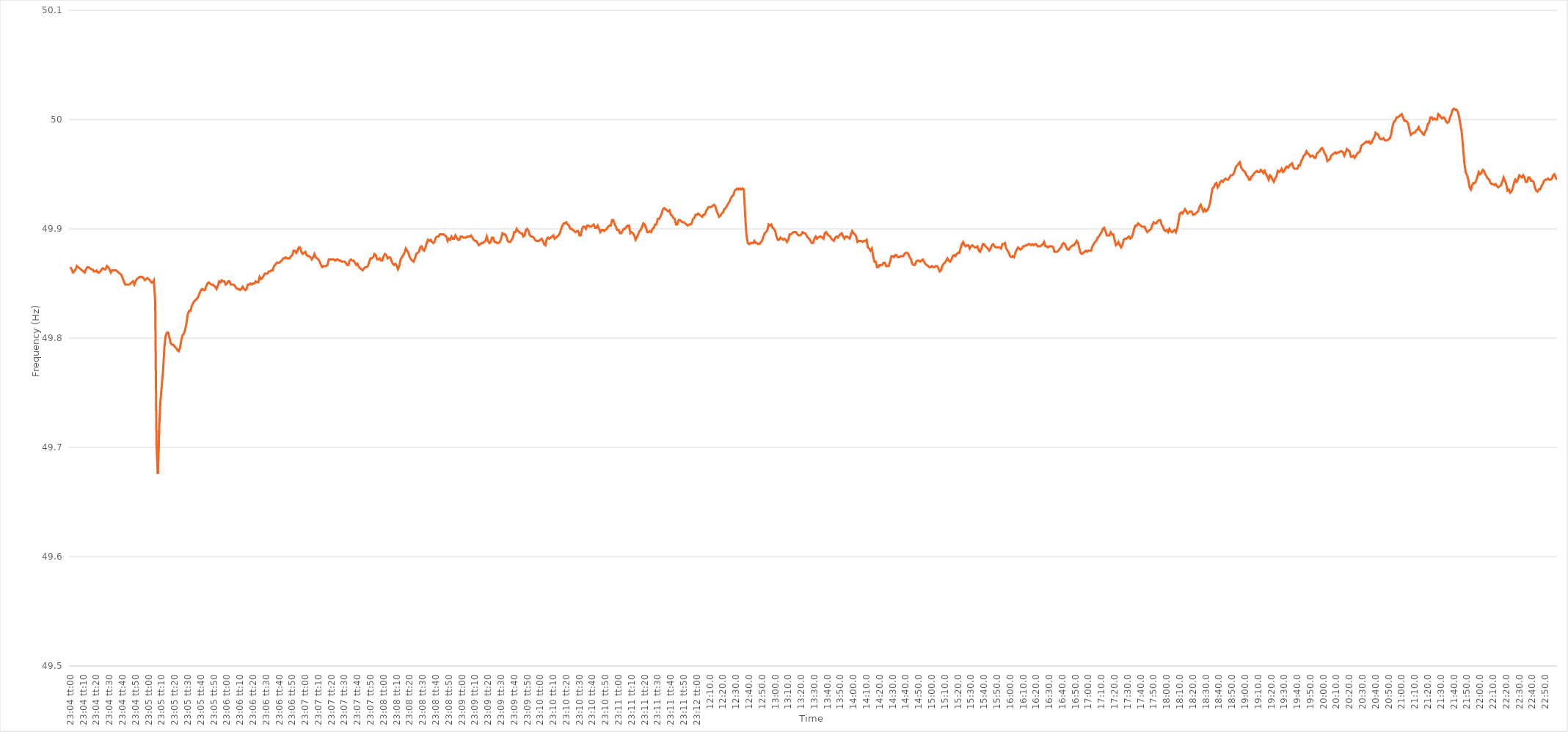
| Category | Series 0 |
|---|---|
| 0.9611111111111111 | 49.865 |
| 0.9611226851851852 | 49.863 |
| 0.9611342592592593 | 49.86 |
| 0.9611458333333333 | 49.861 |
| 0.9611574074074074 | 49.863 |
| 0.9611689814814816 | 49.866 |
| 0.9611805555555555 | 49.865 |
| 0.9611921296296296 | 49.864 |
| 0.9612037037037037 | 49.863 |
| 0.9612152777777778 | 49.862 |
| 0.9612268518518517 | 49.861 |
| 0.9612384259259259 | 49.86 |
| 0.96125 | 49.863 |
| 0.9612615740740741 | 49.865 |
| 0.9612731481481481 | 49.865 |
| 0.9612847222222222 | 49.864 |
| 0.9612962962962963 | 49.863 |
| 0.9613078703703705 | 49.863 |
| 0.9613194444444444 | 49.861 |
| 0.9613310185185185 | 49.861 |
| 0.9613425925925926 | 49.862 |
| 0.9613541666666667 | 49.86 |
| 0.9613657407407407 | 49.86 |
| 0.9613773148148148 | 49.861 |
| 0.961388888888889 | 49.863 |
| 0.961400462962963 | 49.864 |
| 0.961412037037037 | 49.863 |
| 0.9614236111111111 | 49.863 |
| 0.9614351851851852 | 49.866 |
| 0.9614467592592592 | 49.865 |
| 0.9614583333333333 | 49.863 |
| 0.9614699074074075 | 49.86 |
| 0.9614814814814815 | 49.862 |
| 0.9614930555555555 | 49.862 |
| 0.9615046296296296 | 49.862 |
| 0.9615162037037037 | 49.862 |
| 0.9615277777777779 | 49.861 |
| 0.9615393518518518 | 49.86 |
| 0.961550925925926 | 49.859 |
| 0.9615625 | 49.858 |
| 0.9615740740740741 | 49.855 |
| 0.9615856481481481 | 49.852 |
| 0.9615972222222222 | 49.849 |
| 0.9616087962962964 | 49.849 |
| 0.9616203703703704 | 49.849 |
| 0.9616319444444444 | 49.849 |
| 0.9616435185185185 | 49.85 |
| 0.9616550925925926 | 49.851 |
| 0.9616666666666666 | 49.852 |
| 0.9616782407407407 | 49.849 |
| 0.9616898148148149 | 49.852 |
| 0.9617013888888889 | 49.854 |
| 0.9617129629629629 | 49.855 |
| 0.961724537037037 | 49.856 |
| 0.9617361111111111 | 49.856 |
| 0.9617476851851853 | 49.856 |
| 0.9617592592592592 | 49.855 |
| 0.9617708333333334 | 49.853 |
| 0.9617824074074074 | 49.854 |
| 0.9617939814814815 | 49.855 |
| 0.9618055555555555 | 49.854 |
| 0.9618171296296296 | 49.853 |
| 0.9618287037037038 | 49.851 |
| 0.9618402777777778 | 49.851 |
| 0.9618518518518518 | 49.853 |
| 0.9618634259259259 | 49.833 |
| 0.961875 | 49.703 |
| 0.961886574074074 | 49.676 |
| 0.9618981481481481 | 49.716 |
| 0.9619097222222223 | 49.742 |
| 0.9619212962962963 | 49.756 |
| 0.9619328703703703 | 49.77 |
| 0.9619444444444444 | 49.791 |
| 0.9619560185185185 | 49.802 |
| 0.9619675925925927 | 49.805 |
| 0.9619791666666666 | 49.805 |
| 0.9619907407407408 | 49.8 |
| 0.9620023148148148 | 49.795 |
| 0.962013888888889 | 49.794 |
| 0.9620254629629629 | 49.794 |
| 0.962037037037037 | 49.792 |
| 0.9620486111111112 | 49.791 |
| 0.9620601851851852 | 49.789 |
| 0.9620717592592593 | 49.788 |
| 0.9620833333333333 | 49.791 |
| 0.9620949074074074 | 49.798 |
| 0.9621064814814816 | 49.803 |
| 0.9621180555555555 | 49.804 |
| 0.9621296296296297 | 49.808 |
| 0.9621412037037037 | 49.814 |
| 0.9621527777777777 | 49.822 |
| 0.9621643518518518 | 49.825 |
| 0.9621759259259259 | 49.825 |
| 0.9621875000000001 | 49.829 |
| 0.962199074074074 | 49.832 |
| 0.9622106481481482 | 49.834 |
| 0.9622222222222222 | 49.835 |
| 0.9622337962962964 | 49.836 |
| 0.9622453703703703 | 49.838 |
| 0.9622569444444444 | 49.841 |
| 0.9622685185185186 | 49.844 |
| 0.9622800925925926 | 49.845 |
| 0.9622916666666667 | 49.844 |
| 0.9623032407407407 | 49.844 |
| 0.9623148148148148 | 49.847 |
| 0.962326388888889 | 49.85 |
| 0.9623379629629629 | 49.851 |
| 0.9623495370370371 | 49.85 |
| 0.9623611111111111 | 49.849 |
| 0.9623726851851852 | 49.849 |
| 0.9623842592592592 | 49.848 |
| 0.9623958333333333 | 49.847 |
| 0.9624074074074075 | 49.845 |
| 0.9624189814814814 | 49.848 |
| 0.9624305555555556 | 49.852 |
| 0.9624421296296296 | 49.851 |
| 0.9624537037037038 | 49.853 |
| 0.9624652777777777 | 49.852 |
| 0.9624768518518518 | 49.852 |
| 0.962488425925926 | 49.849 |
| 0.9625 | 49.85 |
| 0.9625115740740741 | 49.852 |
| 0.9625231481481481 | 49.852 |
| 0.9625347222222222 | 49.849 |
| 0.9625462962962964 | 49.849 |
| 0.9625578703703703 | 49.849 |
| 0.9625694444444445 | 49.848 |
| 0.9625810185185185 | 49.846 |
| 0.9625925925925927 | 49.845 |
| 0.9626041666666666 | 49.845 |
| 0.9626157407407407 | 49.844 |
| 0.9626273148148149 | 49.845 |
| 0.9626388888888888 | 49.847 |
| 0.962650462962963 | 49.845 |
| 0.962662037037037 | 49.844 |
| 0.9626736111111112 | 49.845 |
| 0.9626851851851851 | 49.849 |
| 0.9626967592592592 | 49.849 |
| 0.9627083333333334 | 49.85 |
| 0.9627199074074074 | 49.849 |
| 0.9627314814814815 | 49.85 |
| 0.9627430555555555 | 49.85 |
| 0.9627546296296297 | 49.852 |
| 0.9627662037037038 | 49.851 |
| 0.9627777777777777 | 49.851 |
| 0.9627893518518519 | 49.856 |
| 0.9628009259259259 | 49.854 |
| 0.9628125000000001 | 49.855 |
| 0.962824074074074 | 49.857 |
| 0.9628356481481481 | 49.859 |
| 0.9628472222222223 | 49.859 |
| 0.9628587962962962 | 49.859 |
| 0.9628703703703704 | 49.861 |
| 0.9628819444444444 | 49.861 |
| 0.9628935185185186 | 49.862 |
| 0.9629050925925925 | 49.862 |
| 0.9629166666666666 | 49.866 |
| 0.9629282407407408 | 49.867 |
| 0.9629398148148148 | 49.869 |
| 0.9629513888888889 | 49.869 |
| 0.9629629629629629 | 49.869 |
| 0.9629745370370371 | 49.87 |
| 0.9629861111111112 | 49.871 |
| 0.9629976851851851 | 49.873 |
| 0.9630092592592593 | 49.873 |
| 0.9630208333333333 | 49.874 |
| 0.9630324074074075 | 49.873 |
| 0.9630439814814814 | 49.873 |
| 0.9630555555555556 | 49.873 |
| 0.9630671296296297 | 49.875 |
| 0.9630787037037036 | 49.876 |
| 0.9630902777777778 | 49.88 |
| 0.9631018518518518 | 49.88 |
| 0.963113425925926 | 49.878 |
| 0.9631249999999999 | 49.88 |
| 0.963136574074074 | 49.883 |
| 0.9631481481481482 | 49.883 |
| 0.9631597222222222 | 49.879 |
| 0.9631712962962963 | 49.877 |
| 0.9631828703703703 | 49.878 |
| 0.9631944444444445 | 49.879 |
| 0.9632060185185186 | 49.876 |
| 0.9632175925925925 | 49.875 |
| 0.9632291666666667 | 49.875 |
| 0.9632407407407407 | 49.874 |
| 0.9632523148148149 | 49.872 |
| 0.9632638888888888 | 49.874 |
| 0.963275462962963 | 49.877 |
| 0.9632870370370371 | 49.874 |
| 0.9632986111111111 | 49.873 |
| 0.9633101851851852 | 49.872 |
| 0.9633217592592592 | 49.87 |
| 0.9633333333333334 | 49.867 |
| 0.9633449074074073 | 49.865 |
| 0.9633564814814815 | 49.866 |
| 0.9633680555555556 | 49.866 |
| 0.9633796296296296 | 49.866 |
| 0.9633912037037037 | 49.867 |
| 0.9634027777777777 | 49.872 |
| 0.9634143518518519 | 49.872 |
| 0.963425925925926 | 49.872 |
| 0.9634375 | 49.872 |
| 0.9634490740740741 | 49.872 |
| 0.9634606481481481 | 49.871 |
| 0.9634722222222223 | 49.872 |
| 0.9634837962962962 | 49.872 |
| 0.9634953703703704 | 49.871 |
| 0.9635069444444445 | 49.871 |
| 0.9635185185185186 | 49.87 |
| 0.9635300925925926 | 49.87 |
| 0.9635416666666666 | 49.87 |
| 0.9635532407407408 | 49.869 |
| 0.9635648148148147 | 49.867 |
| 0.9635763888888889 | 49.867 |
| 0.963587962962963 | 49.871 |
| 0.963599537037037 | 49.872 |
| 0.9636111111111111 | 49.871 |
| 0.9636226851851851 | 49.871 |
| 0.9636342592592593 | 49.869 |
| 0.9636458333333334 | 49.867 |
| 0.9636574074074074 | 49.868 |
| 0.9636689814814815 | 49.865 |
| 0.9636805555555555 | 49.864 |
| 0.9636921296296297 | 49.863 |
| 0.9637037037037036 | 49.862 |
| 0.9637152777777778 | 49.864 |
| 0.9637268518518519 | 49.865 |
| 0.963738425925926 | 49.865 |
| 0.96375 | 49.866 |
| 0.963761574074074 | 49.87 |
| 0.9637731481481482 | 49.873 |
| 0.9637847222222221 | 49.873 |
| 0.9637962962962963 | 49.874 |
| 0.9638078703703704 | 49.877 |
| 0.9638194444444445 | 49.876 |
| 0.9638310185185185 | 49.872 |
| 0.9638425925925925 | 49.872 |
| 0.9638541666666667 | 49.873 |
| 0.9638657407407408 | 49.871 |
| 0.9638773148148148 | 49.871 |
| 0.9638888888888889 | 49.875 |
| 0.963900462962963 | 49.877 |
| 0.9639120370370371 | 49.876 |
| 0.963923611111111 | 49.873 |
| 0.9639351851851852 | 49.874 |
| 0.9639467592592593 | 49.874 |
| 0.9639583333333334 | 49.871 |
| 0.9639699074074074 | 49.868 |
| 0.9639814814814814 | 49.867 |
| 0.9639930555555556 | 49.868 |
| 0.9640046296296297 | 49.866 |
| 0.9640162037037037 | 49.863 |
| 0.9640277777777778 | 49.866 |
| 0.9640393518518519 | 49.872 |
| 0.9640509259259259 | 49.874 |
| 0.9640624999999999 | 49.876 |
| 0.9640740740740741 | 49.878 |
| 0.9640856481481482 | 49.882 |
| 0.9640972222222222 | 49.88 |
| 0.9641087962962963 | 49.878 |
| 0.9641203703703703 | 49.874 |
| 0.9641319444444445 | 49.872 |
| 0.9641435185185184 | 49.871 |
| 0.9641550925925926 | 49.87 |
| 0.9641666666666667 | 49.873 |
| 0.9641782407407408 | 49.877 |
| 0.9641898148148148 | 49.878 |
| 0.9642013888888888 | 49.879 |
| 0.964212962962963 | 49.883 |
| 0.9642245370370371 | 49.884 |
| 0.9642361111111111 | 49.881 |
| 0.9642476851851852 | 49.88 |
| 0.9642592592592593 | 49.883 |
| 0.9642708333333333 | 49.887 |
| 0.9642824074074073 | 49.89 |
| 0.9642939814814815 | 49.889 |
| 0.9643055555555556 | 49.89 |
| 0.9643171296296296 | 49.888 |
| 0.9643287037037037 | 49.887 |
| 0.9643402777777778 | 49.888 |
| 0.9643518518518519 | 49.892 |
| 0.9643634259259258 | 49.893 |
| 0.964375 | 49.893 |
| 0.9643865740740741 | 49.895 |
| 0.9643981481481482 | 49.895 |
| 0.9644097222222222 | 49.895 |
| 0.9644212962962962 | 49.895 |
| 0.9644328703703704 | 49.894 |
| 0.9644444444444445 | 49.893 |
| 0.9644560185185185 | 49.889 |
| 0.9644675925925926 | 49.891 |
| 0.9644791666666667 | 49.89 |
| 0.9644907407407407 | 49.893 |
| 0.9645023148148147 | 49.891 |
| 0.9645138888888889 | 49.891 |
| 0.964525462962963 | 49.894 |
| 0.964537037037037 | 49.892 |
| 0.9645486111111111 | 49.89 |
| 0.9645601851851852 | 49.89 |
| 0.9645717592592593 | 49.893 |
| 0.9645833333333332 | 49.893 |
| 0.9645949074074074 | 49.892 |
| 0.9646064814814815 | 49.892 |
| 0.9646180555555556 | 49.892 |
| 0.9646296296296296 | 49.893 |
| 0.9646412037037037 | 49.893 |
| 0.9646527777777778 | 49.893 |
| 0.964664351851852 | 49.894 |
| 0.9646759259259259 | 49.892 |
| 0.9646875 | 49.89 |
| 0.9646990740740741 | 49.889 |
| 0.9647106481481482 | 49.889 |
| 0.9647222222222221 | 49.887 |
| 0.9647337962962963 | 49.885 |
| 0.9647453703703704 | 49.886 |
| 0.9647569444444444 | 49.887 |
| 0.9647685185185185 | 49.887 |
| 0.9647800925925926 | 49.888 |
| 0.9647916666666667 | 49.889 |
| 0.9648032407407406 | 49.893 |
| 0.9648148148148148 | 49.889 |
| 0.9648263888888889 | 49.887 |
| 0.964837962962963 | 49.888 |
| 0.964849537037037 | 49.892 |
| 0.9648611111111111 | 49.892 |
| 0.9648726851851852 | 49.888 |
| 0.9648842592592594 | 49.888 |
| 0.9648958333333333 | 49.887 |
| 0.9649074074074074 | 49.887 |
| 0.9649189814814815 | 49.888 |
| 0.9649305555555556 | 49.891 |
| 0.9649421296296296 | 49.896 |
| 0.9649537037037037 | 49.895 |
| 0.9649652777777779 | 49.895 |
| 0.9649768518518518 | 49.893 |
| 0.9649884259259259 | 49.889 |
| 0.965 | 49.888 |
| 0.9650115740740741 | 49.888 |
| 0.965023148148148 | 49.89 |
| 0.9650347222222222 | 49.892 |
| 0.9650462962962963 | 49.897 |
| 0.9650578703703704 | 49.897 |
| 0.9650694444444444 | 49.9 |
| 0.9650810185185185 | 49.898 |
| 0.9650925925925926 | 49.897 |
| 0.9651041666666668 | 49.896 |
| 0.9651157407407407 | 49.896 |
| 0.9651273148148148 | 49.893 |
| 0.9651388888888889 | 49.894 |
| 0.965150462962963 | 49.899 |
| 0.965162037037037 | 49.9 |
| 0.9651736111111111 | 49.898 |
| 0.9651851851851853 | 49.894 |
| 0.9651967592592593 | 49.893 |
| 0.9652083333333333 | 49.893 |
| 0.9652199074074074 | 49.892 |
| 0.9652314814814815 | 49.89 |
| 0.9652430555555555 | 49.889 |
| 0.9652546296296296 | 49.889 |
| 0.9652662037037038 | 49.889 |
| 0.9652777777777778 | 49.89 |
| 0.9652893518518518 | 49.891 |
| 0.9653009259259259 | 49.889 |
| 0.9653125 | 49.886 |
| 0.9653240740740742 | 49.885 |
| 0.9653356481481481 | 49.891 |
| 0.9653472222222222 | 49.892 |
| 0.9653587962962963 | 49.891 |
| 0.9653703703703704 | 49.892 |
| 0.9653819444444444 | 49.893 |
| 0.9653935185185185 | 49.894 |
| 0.9654050925925927 | 49.891 |
| 0.9654166666666667 | 49.892 |
| 0.9654282407407407 | 49.893 |
| 0.9654398148148148 | 49.894 |
| 0.9654513888888889 | 49.896 |
| 0.9654629629629629 | 49.9 |
| 0.965474537037037 | 49.903 |
| 0.9654861111111112 | 49.905 |
| 0.9654976851851852 | 49.905 |
| 0.9655092592592592 | 49.906 |
| 0.9655208333333333 | 49.904 |
| 0.9655324074074074 | 49.903 |
| 0.9655439814814816 | 49.9 |
| 0.9655555555555555 | 49.9 |
| 0.9655671296296297 | 49.899 |
| 0.9655787037037037 | 49.898 |
| 0.9655902777777778 | 49.897 |
| 0.9656018518518518 | 49.898 |
| 0.9656134259259259 | 49.898 |
| 0.9656250000000001 | 49.894 |
| 0.9656365740740741 | 49.894 |
| 0.9656481481481481 | 49.9 |
| 0.9656597222222222 | 49.902 |
| 0.9656712962962963 | 49.902 |
| 0.9656828703703703 | 49.9 |
| 0.9656944444444444 | 49.903 |
| 0.9657060185185186 | 49.903 |
| 0.9657175925925926 | 49.902 |
| 0.9657291666666666 | 49.902 |
| 0.9657407407407407 | 49.903 |
| 0.9657523148148148 | 49.904 |
| 0.965763888888889 | 49.901 |
| 0.9657754629629629 | 49.901 |
| 0.965787037037037 | 49.903 |
| 0.9657986111111111 | 49.9 |
| 0.9658101851851852 | 49.897 |
| 0.9658217592592592 | 49.899 |
| 0.9658333333333333 | 49.899 |
| 0.9658449074074075 | 49.898 |
| 0.9658564814814815 | 49.899 |
| 0.9658680555555555 | 49.9 |
| 0.9658796296296296 | 49.902 |
| 0.9658912037037037 | 49.903 |
| 0.9659027777777779 | 49.903 |
| 0.9659143518518518 | 49.908 |
| 0.965925925925926 | 49.908 |
| 0.9659375 | 49.904 |
| 0.965949074074074 | 49.902 |
| 0.9659606481481481 | 49.899 |
| 0.9659722222222222 | 49.899 |
| 0.9659837962962964 | 49.896 |
| 0.9659953703703703 | 49.896 |
| 0.9660069444444445 | 49.898 |
| 0.9660185185185185 | 49.9 |
| 0.9660300925925926 | 49.9 |
| 0.9660416666666666 | 49.902 |
| 0.9660532407407407 | 49.903 |
| 0.9660648148148149 | 49.903 |
| 0.9660763888888889 | 49.896 |
| 0.966087962962963 | 49.897 |
| 0.966099537037037 | 49.896 |
| 0.9661111111111111 | 49.894 |
| 0.9661226851851853 | 49.89 |
| 0.9661342592592592 | 49.892 |
| 0.9661458333333334 | 49.895 |
| 0.9661574074074074 | 49.898 |
| 0.9661689814814814 | 49.899 |
| 0.9661805555555555 | 49.902 |
| 0.9661921296296296 | 49.905 |
| 0.9662037037037038 | 49.904 |
| 0.9662152777777777 | 49.901 |
| 0.9662268518518519 | 49.897 |
| 0.9662384259259259 | 49.897 |
| 0.96625 | 49.898 |
| 0.966261574074074 | 49.897 |
| 0.9662731481481481 | 49.9 |
| 0.9662847222222223 | 49.901 |
| 0.9662962962962963 | 49.904 |
| 0.9663078703703704 | 49.904 |
| 0.9663194444444444 | 49.909 |
| 0.9663310185185185 | 49.909 |
| 0.9663425925925927 | 49.911 |
| 0.9663541666666666 | 49.914 |
| 0.9663657407407408 | 49.918 |
| 0.9663773148148148 | 49.919 |
| 0.9663888888888889 | 49.918 |
| 0.9664004629629629 | 49.917 |
| 0.966412037037037 | 49.916 |
| 0.9664236111111112 | 49.917 |
| 0.9664351851851851 | 49.913 |
| 0.9664467592592593 | 49.912 |
| 0.9664583333333333 | 49.91 |
| 0.9664699074074075 | 49.909 |
| 0.9664814814814814 | 49.904 |
| 0.9664930555555555 | 49.904 |
| 0.9665046296296297 | 49.908 |
| 0.9665162037037037 | 49.908 |
| 0.9665277777777778 | 49.907 |
| 0.9665393518518518 | 49.906 |
| 0.966550925925926 | 49.906 |
| 0.9665625000000001 | 49.905 |
| 0.966574074074074 | 49.904 |
| 0.9665856481481482 | 49.903 |
| 0.9665972222222222 | 49.904 |
| 0.9666087962962964 | 49.904 |
| 0.9666203703703703 | 49.905 |
| 0.9666319444444444 | 49.909 |
| 0.9666435185185186 | 49.91 |
| 0.9666550925925925 | 49.913 |
| 0.9666666666666667 | 49.913 |
| 0.9666782407407407 | 49.914 |
| 0.9666898148148149 | 49.913 |
| 0.9667013888888888 | 49.912 |
| 0.9667129629629629 | 49.911 |
| 0.9667245370370371 | 49.913 |
| 0.9667361111111111 | 49.913 |
| 0.9667476851851852 | 49.916 |
| 0.9667592592592592 | 49.918 |
| 0.9667708333333334 | 49.92 |
| 0.9667824074074075 | 49.92 |
| 0.9667939814814814 | 49.92 |
| 0.9668055555555556 | 49.921 |
| 0.9668171296296296 | 49.922 |
| 0.9668287037037038 | 49.921 |
| 0.9668402777777777 | 49.917 |
| 0.9668518518518519 | 49.914 |
| 0.966863425925926 | 49.911 |
| 0.9668749999999999 | 49.912 |
| 0.9668865740740741 | 49.914 |
| 0.9668981481481481 | 49.915 |
| 0.9669097222222223 | 49.918 |
| 0.9669212962962962 | 49.919 |
| 0.9669328703703703 | 49.921 |
| 0.9669444444444445 | 49.923 |
| 0.9669560185185185 | 49.925 |
| 0.9669675925925926 | 49.928 |
| 0.9669791666666666 | 49.93 |
| 0.9669907407407408 | 49.931 |
| 0.9670023148148149 | 49.935 |
| 0.9670138888888888 | 49.936 |
| 0.967025462962963 | 49.937 |
| 0.967037037037037 | 49.936 |
| 0.9670486111111112 | 49.937 |
| 0.9670601851851851 | 49.936 |
| 0.9670717592592593 | 49.937 |
| 0.9670833333333334 | 49.936 |
| 0.9670949074074073 | 49.912 |
| 0.9671064814814815 | 49.894 |
| 0.9671180555555555 | 49.887 |
| 0.9671296296296297 | 49.886 |
| 0.9671412037037036 | 49.887 |
| 0.9671527777777778 | 49.887 |
| 0.9671643518518519 | 49.887 |
| 0.9671759259259259 | 49.889 |
| 0.9671875 | 49.887 |
| 0.967199074074074 | 49.887 |
| 0.9672106481481482 | 49.886 |
| 0.9672222222222223 | 49.886 |
| 0.9672337962962962 | 49.888 |
| 0.9672453703703704 | 49.889 |
| 0.9672569444444444 | 49.893 |
| 0.9672685185185186 | 49.896 |
| 0.9672800925925925 | 49.897 |
| 0.9672916666666667 | 49.899 |
| 0.9673032407407408 | 49.904 |
| 0.9673148148148148 | 49.903 |
| 0.9673263888888889 | 49.904 |
| 0.9673379629629629 | 49.901 |
| 0.9673495370370371 | 49.9 |
| 0.967361111111111 | 49.898 |
| 0.9673726851851852 | 49.893 |
| 0.9673842592592593 | 49.89 |
| 0.9673958333333333 | 49.89 |
| 0.9674074074074074 | 49.892 |
| 0.9674189814814814 | 49.891 |
| 0.9674305555555556 | 49.89 |
| 0.9674421296296297 | 49.891 |
| 0.9674537037037036 | 49.89 |
| 0.9674652777777778 | 49.888 |
| 0.9674768518518518 | 49.89 |
| 0.967488425925926 | 49.895 |
| 0.9674999999999999 | 49.895 |
| 0.9675115740740741 | 49.896 |
| 0.9675231481481482 | 49.897 |
| 0.9675347222222223 | 49.897 |
| 0.9675462962962963 | 49.897 |
| 0.9675578703703703 | 49.895 |
| 0.9675694444444445 | 49.894 |
| 0.9675810185185184 | 49.894 |
| 0.9675925925925926 | 49.895 |
| 0.9676041666666667 | 49.897 |
| 0.9676157407407407 | 49.896 |
| 0.9676273148148148 | 49.896 |
| 0.9676388888888888 | 49.894 |
| 0.967650462962963 | 49.892 |
| 0.9676620370370371 | 49.891 |
| 0.967673611111111 | 49.889 |
| 0.9676851851851852 | 49.887 |
| 0.9676967592592592 | 49.887 |
| 0.9677083333333334 | 49.891 |
| 0.9677199074074073 | 49.893 |
| 0.9677314814814815 | 49.891 |
| 0.9677430555555556 | 49.892 |
| 0.9677546296296297 | 49.893 |
| 0.9677662037037037 | 49.893 |
| 0.9677777777777777 | 49.892 |
| 0.9677893518518519 | 49.891 |
| 0.967800925925926 | 49.896 |
| 0.9678125 | 49.897 |
| 0.9678240740740741 | 49.895 |
| 0.9678356481481482 | 49.894 |
| 0.9678472222222222 | 49.893 |
| 0.9678587962962962 | 49.891 |
| 0.9678703703703704 | 49.89 |
| 0.9678819444444445 | 49.889 |
| 0.9678935185185185 | 49.892 |
| 0.9679050925925926 | 49.893 |
| 0.9679166666666666 | 49.892 |
| 0.9679282407407408 | 49.894 |
| 0.9679398148148147 | 49.895 |
| 0.9679513888888889 | 49.896 |
| 0.967962962962963 | 49.893 |
| 0.9679745370370371 | 49.891 |
| 0.9679861111111111 | 49.893 |
| 0.9679976851851851 | 49.893 |
| 0.9680092592592593 | 49.892 |
| 0.9680208333333334 | 49.891 |
| 0.9680324074074074 | 49.895 |
| 0.9680439814814815 | 49.898 |
| 0.9680555555555556 | 49.896 |
| 0.9680671296296296 | 49.895 |
| 0.9680787037037036 | 49.893 |
| 0.9680902777777778 | 49.888 |
| 0.9681018518518519 | 49.889 |
| 0.9681134259259259 | 49.889 |
| 0.968125 | 49.889 |
| 0.968136574074074 | 49.888 |
| 0.9681481481481482 | 49.889 |
| 0.9681597222222221 | 49.889 |
| 0.9681712962962963 | 49.89 |
| 0.9681828703703704 | 49.883 |
| 0.9681944444444445 | 49.882 |
| 0.9682060185185185 | 49.88 |
| 0.9682175925925925 | 49.882 |
| 0.9682291666666667 | 49.875 |
| 0.9682407407407408 | 49.87 |
| 0.9682523148148148 | 49.87 |
| 0.9682638888888889 | 49.865 |
| 0.968275462962963 | 49.865 |
| 0.968287037037037 | 49.867 |
| 0.968298611111111 | 49.867 |
| 0.9683101851851852 | 49.867 |
| 0.9683217592592593 | 49.869 |
| 0.9683333333333333 | 49.869 |
| 0.9683449074074074 | 49.866 |
| 0.9683564814814815 | 49.866 |
| 0.9683680555555556 | 49.866 |
| 0.9683796296296295 | 49.87 |
| 0.9683912037037037 | 49.875 |
| 0.9684027777777778 | 49.875 |
| 0.9684143518518519 | 49.874 |
| 0.9684259259259259 | 49.876 |
| 0.9684375 | 49.876 |
| 0.9684490740740741 | 49.874 |
| 0.9684606481481483 | 49.874 |
| 0.9684722222222222 | 49.875 |
| 0.9684837962962963 | 49.875 |
| 0.9684953703703704 | 49.875 |
| 0.9685069444444445 | 49.877 |
| 0.9685185185185184 | 49.878 |
| 0.9685300925925926 | 49.878 |
| 0.9685416666666667 | 49.877 |
| 0.9685532407407407 | 49.874 |
| 0.9685648148148148 | 49.872 |
| 0.9685763888888889 | 49.868 |
| 0.968587962962963 | 49.867 |
| 0.9685995370370369 | 49.867 |
| 0.9686111111111111 | 49.87 |
| 0.9686226851851852 | 49.871 |
| 0.9686342592592593 | 49.871 |
| 0.9686458333333333 | 49.87 |
| 0.9686574074074074 | 49.871 |
| 0.9686689814814815 | 49.872 |
| 0.9686805555555557 | 49.87 |
| 0.9686921296296296 | 49.868 |
| 0.9687037037037037 | 49.867 |
| 0.9687152777777778 | 49.866 |
| 0.9687268518518519 | 49.865 |
| 0.9687384259259259 | 49.865 |
| 0.96875 | 49.866 |
| 0.9687615740740741 | 49.865 |
| 0.9687731481481481 | 49.865 |
| 0.9687847222222222 | 49.866 |
| 0.9687962962962963 | 49.866 |
| 0.9688078703703704 | 49.864 |
| 0.9688194444444443 | 49.861 |
| 0.9688310185185185 | 49.862 |
| 0.9688425925925926 | 49.866 |
| 0.9688541666666667 | 49.868 |
| 0.9688657407407407 | 49.869 |
| 0.9688773148148148 | 49.871 |
| 0.9688888888888889 | 49.873 |
| 0.9689004629629631 | 49.871 |
| 0.968912037037037 | 49.87 |
| 0.9689236111111111 | 49.872 |
| 0.9689351851851852 | 49.875 |
| 0.9689467592592593 | 49.876 |
| 0.9689583333333333 | 49.875 |
| 0.9689699074074074 | 49.877 |
| 0.9689814814814816 | 49.878 |
| 0.9689930555555555 | 49.878 |
| 0.9690046296296296 | 49.882 |
| 0.9690162037037037 | 49.886 |
| 0.9690277777777778 | 49.888 |
| 0.9690393518518517 | 49.885 |
| 0.9690509259259259 | 49.884 |
| 0.9690625 | 49.885 |
| 0.9690740740740741 | 49.885 |
| 0.9690856481481481 | 49.882 |
| 0.9690972222222222 | 49.884 |
| 0.9691087962962963 | 49.885 |
| 0.9691203703703705 | 49.884 |
| 0.9691319444444444 | 49.883 |
| 0.9691435185185185 | 49.883 |
| 0.9691550925925926 | 49.884 |
| 0.9691666666666667 | 49.88 |
| 0.9691782407407407 | 49.879 |
| 0.9691898148148148 | 49.882 |
| 0.969201388888889 | 49.886 |
| 0.969212962962963 | 49.886 |
| 0.969224537037037 | 49.884 |
| 0.9692361111111111 | 49.883 |
| 0.9692476851851852 | 49.882 |
| 0.9692592592592592 | 49.88 |
| 0.9692708333333333 | 49.882 |
| 0.9692824074074075 | 49.885 |
| 0.9692939814814815 | 49.886 |
| 0.9693055555555555 | 49.884 |
| 0.9693171296296296 | 49.883 |
| 0.9693287037037037 | 49.883 |
| 0.9693402777777779 | 49.883 |
| 0.9693518518518518 | 49.883 |
| 0.969363425925926 | 49.882 |
| 0.969375 | 49.886 |
| 0.9693865740740741 | 49.886 |
| 0.9693981481481481 | 49.887 |
| 0.9694097222222222 | 49.882 |
| 0.9694212962962964 | 49.88 |
| 0.9694328703703704 | 49.878 |
| 0.9694444444444444 | 49.875 |
| 0.9694560185185185 | 49.874 |
| 0.9694675925925926 | 49.875 |
| 0.9694791666666666 | 49.874 |
| 0.9694907407407407 | 49.878 |
| 0.9695023148148149 | 49.881 |
| 0.9695138888888889 | 49.883 |
| 0.9695254629629629 | 49.882 |
| 0.969537037037037 | 49.881 |
| 0.9695486111111111 | 49.882 |
| 0.9695601851851853 | 49.884 |
| 0.9695717592592592 | 49.884 |
| 0.9695833333333334 | 49.885 |
| 0.9695949074074074 | 49.885 |
| 0.9696064814814815 | 49.886 |
| 0.9696180555555555 | 49.886 |
| 0.9696296296296296 | 49.885 |
| 0.9696412037037038 | 49.886 |
| 0.9696527777777778 | 49.885 |
| 0.9696643518518518 | 49.886 |
| 0.9696759259259259 | 49.886 |
| 0.9696875 | 49.884 |
| 0.969699074074074 | 49.884 |
| 0.9697106481481481 | 49.884 |
| 0.9697222222222223 | 49.885 |
| 0.9697337962962963 | 49.886 |
| 0.9697453703703703 | 49.888 |
| 0.9697569444444444 | 49.884 |
| 0.9697685185185185 | 49.884 |
| 0.9697800925925927 | 49.883 |
| 0.9697916666666666 | 49.884 |
| 0.9698032407407408 | 49.884 |
| 0.9698148148148148 | 49.884 |
| 0.969826388888889 | 49.883 |
| 0.9698379629629629 | 49.879 |
| 0.969849537037037 | 49.879 |
| 0.9698611111111112 | 49.879 |
| 0.9698726851851852 | 49.88 |
| 0.9698842592592593 | 49.882 |
| 0.9698958333333333 | 49.883 |
| 0.9699074074074074 | 49.886 |
| 0.9699189814814816 | 49.887 |
| 0.9699305555555555 | 49.886 |
| 0.9699421296296297 | 49.883 |
| 0.9699537037037037 | 49.881 |
| 0.9699652777777777 | 49.881 |
| 0.9699768518518518 | 49.883 |
| 0.9699884259259259 | 49.884 |
| 0.9700000000000001 | 49.885 |
| 0.970011574074074 | 49.885 |
| 0.9700231481481482 | 49.887 |
| 0.9700347222222222 | 49.889 |
| 0.9700462962962964 | 49.887 |
| 0.9700578703703703 | 49.882 |
| 0.9700694444444444 | 49.878 |
| 0.9700810185185186 | 49.877 |
| 0.9700925925925926 | 49.878 |
| 0.9701041666666667 | 49.879 |
| 0.9701157407407407 | 49.88 |
| 0.9701273148148148 | 49.879 |
| 0.970138888888889 | 49.88 |
| 0.9701504629629629 | 49.88 |
| 0.9701620370370371 | 49.88 |
| 0.9701736111111111 | 49.884 |
| 0.9701851851851852 | 49.886 |
| 0.9701967592592592 | 49.888 |
| 0.9702083333333333 | 49.889 |
| 0.9702199074074075 | 49.892 |
| 0.9702314814814814 | 49.893 |
| 0.9702430555555556 | 49.895 |
| 0.9702546296296296 | 49.897 |
| 0.9702662037037038 | 49.9 |
| 0.9702777777777777 | 49.901 |
| 0.9702893518518518 | 49.898 |
| 0.970300925925926 | 49.894 |
| 0.9703125 | 49.894 |
| 0.9703240740740741 | 49.894 |
| 0.9703356481481481 | 49.897 |
| 0.9703472222222222 | 49.895 |
| 0.9703587962962964 | 49.895 |
| 0.9703703703703703 | 49.89 |
| 0.9703819444444445 | 49.885 |
| 0.9703935185185185 | 49.886 |
| 0.9704050925925927 | 49.888 |
| 0.9704166666666666 | 49.885 |
| 0.9704282407407407 | 49.883 |
| 0.9704398148148149 | 49.885 |
| 0.9704513888888888 | 49.89 |
| 0.970462962962963 | 49.891 |
| 0.970474537037037 | 49.891 |
| 0.9704861111111112 | 49.892 |
| 0.9704976851851851 | 49.893 |
| 0.9705092592592592 | 49.891 |
| 0.9705208333333334 | 49.892 |
| 0.9705324074074074 | 49.895 |
| 0.9705439814814815 | 49.9 |
| 0.9705555555555555 | 49.903 |
| 0.9705671296296297 | 49.903 |
| 0.9705787037037038 | 49.905 |
| 0.9705902777777777 | 49.904 |
| 0.9706018518518519 | 49.903 |
| 0.9706134259259259 | 49.902 |
| 0.9706250000000001 | 49.902 |
| 0.970636574074074 | 49.902 |
| 0.9706481481481481 | 49.899 |
| 0.9706597222222223 | 49.897 |
| 0.9706712962962962 | 49.898 |
| 0.9706828703703704 | 49.899 |
| 0.9706944444444444 | 49.9 |
| 0.9707060185185186 | 49.904 |
| 0.9707175925925925 | 49.906 |
| 0.9707291666666666 | 49.905 |
| 0.9707407407407408 | 49.905 |
| 0.9707523148148148 | 49.907 |
| 0.9707638888888889 | 49.908 |
| 0.9707754629629629 | 49.908 |
| 0.9707870370370371 | 49.904 |
| 0.9707986111111112 | 49.902 |
| 0.9708101851851851 | 49.899 |
| 0.9708217592592593 | 49.898 |
| 0.9708333333333333 | 49.899 |
| 0.9708449074074075 | 49.897 |
| 0.9708564814814814 | 49.9 |
| 0.9708680555555556 | 49.898 |
| 0.9708796296296297 | 49.897 |
| 0.9708912037037036 | 49.898 |
| 0.9709027777777778 | 49.899 |
| 0.9709143518518518 | 49.897 |
| 0.970925925925926 | 49.901 |
| 0.9709374999999999 | 49.907 |
| 0.970949074074074 | 49.914 |
| 0.9709606481481482 | 49.915 |
| 0.9709722222222222 | 49.914 |
| 0.9709837962962963 | 49.916 |
| 0.9709953703703703 | 49.918 |
| 0.9710069444444445 | 49.916 |
| 0.9710185185185186 | 49.914 |
| 0.9710300925925925 | 49.915 |
| 0.9710416666666667 | 49.916 |
| 0.9710532407407407 | 49.916 |
| 0.9710648148148149 | 49.913 |
| 0.9710763888888888 | 49.913 |
| 0.971087962962963 | 49.914 |
| 0.9710995370370371 | 49.915 |
| 0.971111111111111 | 49.916 |
| 0.9711226851851852 | 49.92 |
| 0.9711342592592592 | 49.922 |
| 0.9711458333333334 | 49.919 |
| 0.9711574074074073 | 49.916 |
| 0.9711689814814815 | 49.918 |
| 0.9711805555555556 | 49.916 |
| 0.9711921296296296 | 49.917 |
| 0.9712037037037037 | 49.919 |
| 0.9712152777777777 | 49.923 |
| 0.9712268518518519 | 49.93 |
| 0.971238425925926 | 49.937 |
| 0.97125 | 49.938 |
| 0.9712615740740741 | 49.941 |
| 0.9712731481481481 | 49.942 |
| 0.9712847222222223 | 49.938 |
| 0.9712962962962962 | 49.94 |
| 0.9713078703703704 | 49.943 |
| 0.9713194444444445 | 49.944 |
| 0.9713310185185186 | 49.943 |
| 0.9713425925925926 | 49.945 |
| 0.9713541666666666 | 49.946 |
| 0.9713657407407408 | 49.945 |
| 0.9713773148148147 | 49.945 |
| 0.9713888888888889 | 49.947 |
| 0.971400462962963 | 49.949 |
| 0.971412037037037 | 49.949 |
| 0.9714236111111111 | 49.95 |
| 0.9714351851851851 | 49.953 |
| 0.9714467592592593 | 49.957 |
| 0.9714583333333334 | 49.958 |
| 0.9714699074074074 | 49.96 |
| 0.9714814814814815 | 49.961 |
| 0.9714930555555555 | 49.956 |
| 0.9715046296296297 | 49.954 |
| 0.9715162037037036 | 49.953 |
| 0.9715277777777778 | 49.952 |
| 0.9715393518518519 | 49.949 |
| 0.971550925925926 | 49.948 |
| 0.9715625 | 49.945 |
| 0.971574074074074 | 49.945 |
| 0.9715856481481482 | 49.948 |
| 0.9715972222222223 | 49.949 |
| 0.9716087962962963 | 49.951 |
| 0.9716203703703704 | 49.952 |
| 0.9716319444444445 | 49.953 |
| 0.9716435185185185 | 49.952 |
| 0.9716550925925925 | 49.952 |
| 0.9716666666666667 | 49.954 |
| 0.9716782407407408 | 49.953 |
| 0.9716898148148148 | 49.951 |
| 0.9717013888888889 | 49.953 |
| 0.971712962962963 | 49.95 |
| 0.9717245370370371 | 49.948 |
| 0.971736111111111 | 49.945 |
| 0.9717476851851852 | 49.949 |
| 0.9717592592592593 | 49.948 |
| 0.9717708333333334 | 49.945 |
| 0.9717824074074074 | 49.943 |
| 0.9717939814814814 | 49.946 |
| 0.9718055555555556 | 49.948 |
| 0.9718171296296297 | 49.953 |
| 0.9718287037037037 | 49.952 |
| 0.9718402777777778 | 49.953 |
| 0.9718518518518519 | 49.955 |
| 0.9718634259259259 | 49.952 |
| 0.9718749999999999 | 49.953 |
| 0.9718865740740741 | 49.956 |
| 0.9718981481481482 | 49.957 |
| 0.9719097222222222 | 49.956 |
| 0.9719212962962963 | 49.958 |
| 0.9719328703703703 | 49.959 |
| 0.9719444444444445 | 49.96 |
| 0.9719560185185184 | 49.956 |
| 0.9719675925925926 | 49.955 |
| 0.9719791666666667 | 49.955 |
| 0.9719907407407408 | 49.955 |
| 0.9720023148148148 | 49.958 |
| 0.9720138888888888 | 49.958 |
| 0.972025462962963 | 49.962 |
| 0.9720370370370371 | 49.964 |
| 0.9720486111111111 | 49.967 |
| 0.9720601851851852 | 49.968 |
| 0.9720717592592593 | 49.971 |
| 0.9720833333333333 | 49.969 |
| 0.9720949074074073 | 49.968 |
| 0.9721064814814815 | 49.966 |
| 0.9721180555555556 | 49.967 |
| 0.9721296296296296 | 49.967 |
| 0.9721412037037037 | 49.965 |
| 0.9721527777777778 | 49.965 |
| 0.9721643518518519 | 49.969 |
| 0.9721759259259258 | 49.97 |
| 0.9721875 | 49.971 |
| 0.9721990740740741 | 49.973 |
| 0.9722106481481482 | 49.974 |
| 0.9722222222222222 | 49.972 |
| 0.9722337962962962 | 49.969 |
| 0.9722453703703704 | 49.967 |
| 0.9722569444444445 | 49.962 |
| 0.9722685185185185 | 49.963 |
| 0.9722800925925926 | 49.964 |
| 0.9722916666666667 | 49.967 |
| 0.9723032407407407 | 49.968 |
| 0.9723148148148147 | 49.969 |
| 0.9723263888888889 | 49.97 |
| 0.972337962962963 | 49.969 |
| 0.972349537037037 | 49.97 |
| 0.9723611111111111 | 49.97 |
| 0.9723726851851852 | 49.971 |
| 0.9723842592592593 | 49.971 |
| 0.9723958333333332 | 49.97 |
| 0.9724074074074074 | 49.967 |
| 0.9724189814814815 | 49.97 |
| 0.9724305555555556 | 49.973 |
| 0.9724421296296296 | 49.972 |
| 0.9724537037037037 | 49.971 |
| 0.9724652777777778 | 49.966 |
| 0.972476851851852 | 49.966 |
| 0.9724884259259259 | 49.967 |
| 0.9725 | 49.965 |
| 0.9725115740740741 | 49.967 |
| 0.9725231481481482 | 49.969 |
| 0.9725347222222221 | 49.97 |
| 0.9725462962962963 | 49.971 |
| 0.9725578703703704 | 49.976 |
| 0.9725694444444444 | 49.977 |
| 0.9725810185185185 | 49.978 |
| 0.9725925925925926 | 49.979 |
| 0.9726041666666667 | 49.98 |
| 0.9726157407407406 | 49.979 |
| 0.9726273148148148 | 49.98 |
| 0.9726388888888889 | 49.978 |
| 0.972650462962963 | 49.979 |
| 0.972662037037037 | 49.982 |
| 0.9726736111111111 | 49.984 |
| 0.9726851851851852 | 49.988 |
| 0.9726967592592594 | 49.987 |
| 0.9727083333333333 | 49.986 |
| 0.9727199074074074 | 49.983 |
| 0.9727314814814815 | 49.982 |
| 0.9727430555555556 | 49.982 |
| 0.9727546296296296 | 49.983 |
| 0.9727662037037037 | 49.981 |
| 0.9727777777777779 | 49.981 |
| 0.9727893518518518 | 49.981 |
| 0.9728009259259259 | 49.982 |
| 0.9728125 | 49.983 |
| 0.9728240740740741 | 49.987 |
| 0.972835648148148 | 49.994 |
| 0.9728472222222222 | 49.998 |
| 0.9728587962962963 | 49.999 |
| 0.9728703703703704 | 50.002 |
| 0.9728819444444444 | 50.002 |
| 0.9728935185185185 | 50.003 |
| 0.9729050925925926 | 50.004 |
| 0.9729166666666668 | 50.005 |
| 0.9729282407407407 | 50.002 |
| 0.9729398148148148 | 49.999 |
| 0.9729513888888889 | 49.999 |
| 0.972962962962963 | 49.998 |
| 0.972974537037037 | 49.996 |
| 0.9729861111111111 | 49.99 |
| 0.9729976851851853 | 49.986 |
| 0.9730092592592593 | 49.987 |
| 0.9730208333333333 | 49.988 |
| 0.9730324074074074 | 49.988 |
| 0.9730439814814815 | 49.99 |
| 0.9730555555555555 | 49.991 |
| 0.9730671296296296 | 49.993 |
| 0.9730787037037038 | 49.99 |
| 0.9730902777777778 | 49.989 |
| 0.9731018518518518 | 49.987 |
| 0.9731134259259259 | 49.986 |
| 0.973125 | 49.989 |
| 0.9731365740740742 | 49.991 |
| 0.9731481481481481 | 49.996 |
| 0.9731597222222222 | 49.997 |
| 0.9731712962962963 | 50.002 |
| 0.9731828703703704 | 50.002 |
| 0.9731944444444444 | 50 |
| 0.9732060185185185 | 50.001 |
| 0.9732175925925927 | 50 |
| 0.9732291666666667 | 50 |
| 0.9732407407407407 | 50.005 |
| 0.9732523148148148 | 50.004 |
| 0.9732638888888889 | 50.002 |
| 0.9732754629629629 | 50.001 |
| 0.973287037037037 | 50.002 |
| 0.9732986111111112 | 50.001 |
| 0.9733101851851852 | 49.998 |
| 0.9733217592592592 | 49.997 |
| 0.9733333333333333 | 49.998 |
| 0.9733449074074074 | 50.002 |
| 0.9733564814814816 | 50.005 |
| 0.9733680555555555 | 50.009 |
| 0.9733796296296297 | 50.01 |
| 0.9733912037037037 | 50.009 |
| 0.9734027777777778 | 50.009 |
| 0.9734143518518518 | 50.007 |
| 0.9734259259259259 | 50.002 |
| 0.9734375000000001 | 49.995 |
| 0.9734490740740741 | 49.988 |
| 0.9734606481481481 | 49.974 |
| 0.9734722222222222 | 49.96 |
| 0.9734837962962963 | 49.952 |
| 0.9734953703703703 | 49.949 |
| 0.9735069444444444 | 49.945 |
| 0.9735185185185186 | 49.938 |
| 0.9735300925925926 | 49.936 |
| 0.9735416666666666 | 49.94 |
| 0.9735532407407407 | 49.942 |
| 0.9735648148148148 | 49.942 |
| 0.973576388888889 | 49.944 |
| 0.9735879629629629 | 49.948 |
| 0.973599537037037 | 49.952 |
| 0.9736111111111111 | 49.95 |
| 0.9736226851851852 | 49.951 |
| 0.9736342592592592 | 49.954 |
| 0.9736458333333333 | 49.953 |
| 0.9736574074074075 | 49.95 |
| 0.9736689814814815 | 49.948 |
| 0.9736805555555555 | 49.946 |
| 0.9736921296296296 | 49.945 |
| 0.9737037037037037 | 49.942 |
| 0.9737152777777777 | 49.941 |
| 0.9737268518518518 | 49.941 |
| 0.973738425925926 | 49.94 |
| 0.97375 | 49.941 |
| 0.973761574074074 | 49.939 |
| 0.9737731481481481 | 49.938 |
| 0.9737847222222222 | 49.939 |
| 0.9737962962962964 | 49.94 |
| 0.9738078703703703 | 49.943 |
| 0.9738194444444445 | 49.947 |
| 0.9738310185185185 | 49.944 |
| 0.9738425925925926 | 49.941 |
| 0.9738541666666666 | 49.935 |
| 0.9738657407407407 | 49.936 |
| 0.9738773148148149 | 49.933 |
| 0.9738888888888889 | 49.934 |
| 0.973900462962963 | 49.937 |
| 0.973912037037037 | 49.942 |
| 0.9739236111111111 | 49.945 |
| 0.9739351851851853 | 49.943 |
| 0.9739467592592592 | 49.945 |
| 0.9739583333333334 | 49.949 |
| 0.9739699074074074 | 49.948 |
| 0.9739814814814814 | 49.947 |
| 0.9739930555555555 | 49.949 |
| 0.9740046296296296 | 49.947 |
| 0.9740162037037038 | 49.943 |
| 0.9740277777777777 | 49.943 |
| 0.9740393518518519 | 49.947 |
| 0.9740509259259259 | 49.947 |
| 0.9740625 | 49.944 |
| 0.974074074074074 | 49.944 |
| 0.9740856481481481 | 49.943 |
| 0.9740972222222223 | 49.938 |
| 0.9741087962962963 | 49.935 |
| 0.9741203703703704 | 49.934 |
| 0.9741319444444444 | 49.936 |
| 0.9741435185185185 | 49.936 |
| 0.9741550925925927 | 49.939 |
| 0.9741666666666666 | 49.941 |
| 0.9741782407407408 | 49.944 |
| 0.9741898148148148 | 49.945 |
| 0.974201388888889 | 49.945 |
| 0.9742129629629629 | 49.946 |
| 0.974224537037037 | 49.945 |
| 0.9742361111111112 | 49.945 |
| 0.9742476851851851 | 49.946 |
| 0.9742592592592593 | 49.949 |
| 0.9742708333333333 | 49.95 |
| 0.9742824074074075 | 49.947 |
| 0.9742939814814814 | 49.945 |